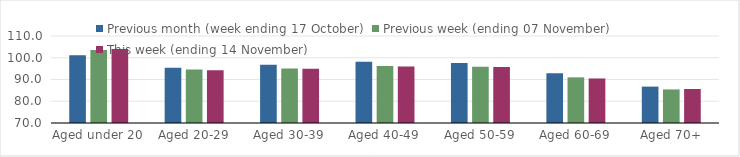
| Category | Previous month (week ending 17 October) | Previous week (ending 07 November) | This week (ending 14 November) |
|---|---|---|---|
| Aged under 20 | 101.14 | 103.56 | 104.01 |
| Aged 20-29 | 95.36 | 94.55 | 94.3 |
| Aged 30-39 | 96.78 | 95.11 | 94.93 |
| Aged 40-49 | 98.21 | 96.21 | 96.01 |
| Aged 50-59 | 97.6 | 95.82 | 95.74 |
| Aged 60-69 | 92.87 | 90.98 | 90.48 |
| Aged 70+ | 86.73 | 85.43 | 85.64 |